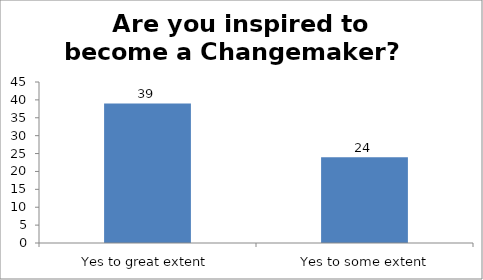
| Category | Are you inspired to become a Changemaker?   |
|---|---|
| Yes to great extent | 39 |
|  Yes to some extent | 24 |